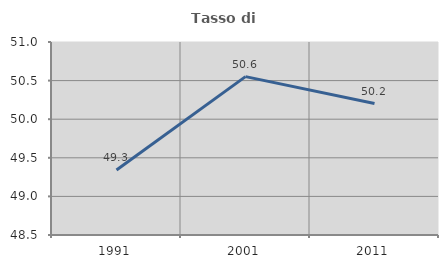
| Category | Tasso di occupazione   |
|---|---|
| 1991.0 | 49.342 |
| 2001.0 | 50.551 |
| 2011.0 | 50.203 |